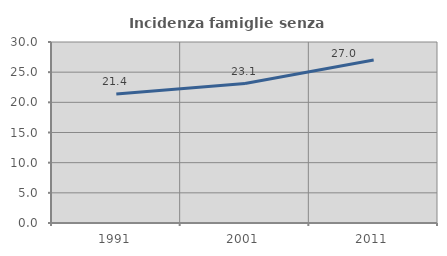
| Category | Incidenza famiglie senza nuclei |
|---|---|
| 1991.0 | 21.384 |
| 2001.0 | 23.11 |
| 2011.0 | 27.006 |